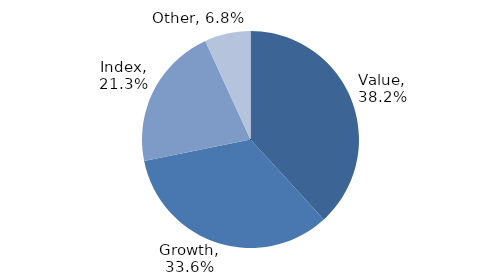
| Category | Investment Style |
|---|---|
| Value | 0.382 |
| Growth | 0.336 |
| Index | 0.213 |
| Other | 0.068 |